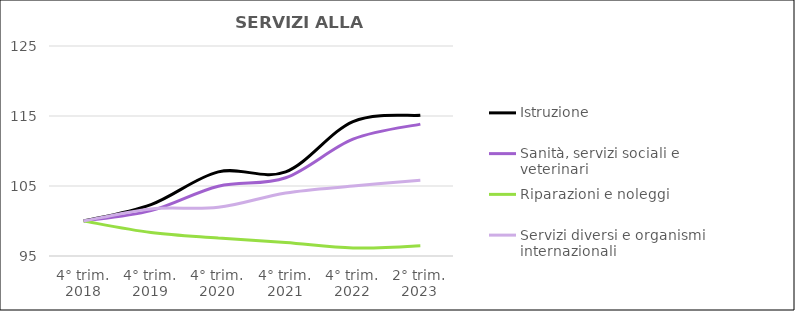
| Category | Istruzione | Sanità, servizi sociali e veterinari  | Riparazioni e noleggi  | Servizi diversi e organismi internazionali |
|---|---|---|---|---|
| 4° trim.
2018 | 100 | 100 | 100 | 100 |
| 4° trim.
2019 | 102.338 | 101.478 | 98.347 | 101.73 |
| 4° trim.
2020 | 107.014 | 104.973 | 97.567 | 101.954 |
| 4° trim.
2021 | 107.014 | 106.183 | 96.924 | 104.004 |
| 4° trim.
2022 | 114.209 | 111.694 | 96.143 | 104.997 |
| 2° trim.
2023 | 115.108 | 113.844 | 96.465 | 105.83 |